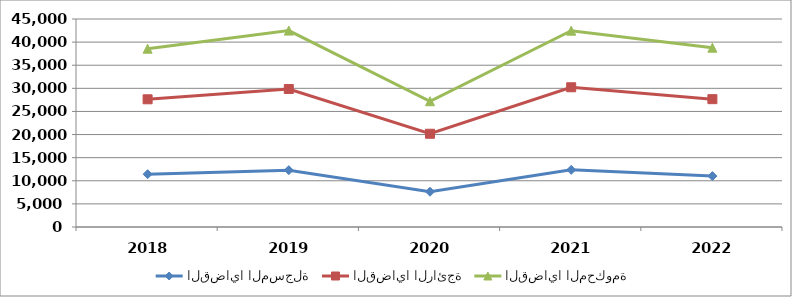
| Category | القضايا المسجلة | القضايا الرائجة | القضايا المحكومة |
|---|---|---|---|
| 2018.0 | 11428 | 16201 | 10942 |
| 2019.0 | 12297 | 17555 | 12639 |
| 2020.0 | 7628 | 12544 | 7035 |
| 2021.0 | 12361 | 17870 | 12236 |
| 2022.0 | 11011 | 16647 | 11129 |